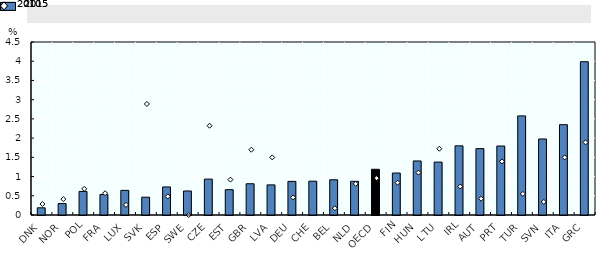
| Category | 2015 |
|---|---|
| DNK | 0.187 |
| NOR | 0.298 |
| POL | 0.613 |
| FRA | 0.533 |
| LUX | 0.641 |
| SVK | 0.463 |
| ESP | 0.73 |
| SWE | 0.625 |
| CZE | 0.933 |
| EST | 0.659 |
| GBR | 0.813 |
| LVA | 0.783 |
| DEU | 0.875 |
| CHE | 0.88 |
| BEL | 0.916 |
| NLD | 0.876 |
| OECD | 1.189 |
| FIN | 1.092 |
| HUN | 1.406 |
| LTU | 1.376 |
| IRL | 1.799 |
| AUT | 1.727 |
| PRT | 1.794 |
| TUR | 2.578 |
| SVN | 1.977 |
| ITA | 2.349 |
| GRC | 3.988 |